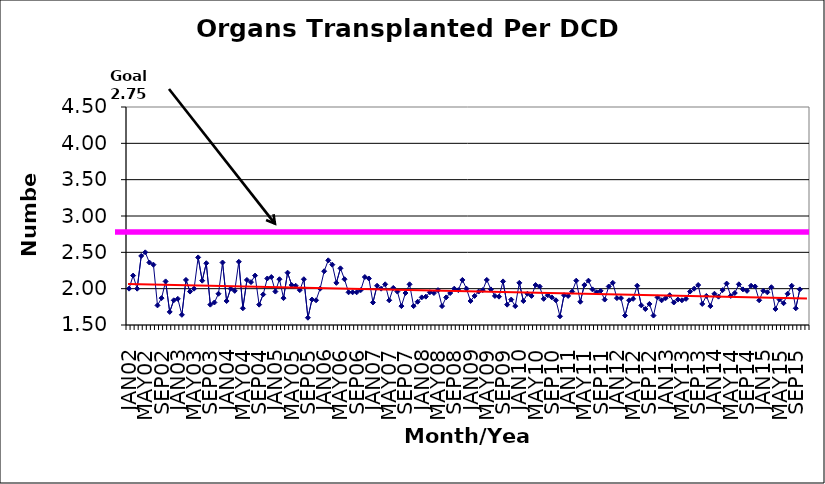
| Category | Series 0 |
|---|---|
| JAN02 | 2 |
| FEB02 | 2.18 |
| MAR02 | 2 |
| APR02 | 2.45 |
| MAY02 | 2.5 |
| JUN02 | 2.36 |
| JUL02 | 2.33 |
| AUG02 | 1.77 |
| SEP02 | 1.87 |
| OCT02 | 2.1 |
| NOV02 | 1.68 |
| DEC02 | 1.84 |
| JAN03 | 1.86 |
| FEB03 | 1.64 |
| MAR03 | 2.12 |
| APR03 | 1.96 |
| MAY03 | 2 |
| JUN03 | 2.43 |
| JUL03 | 2.11 |
| AUG03 | 2.35 |
| SEP03 | 1.78 |
| OCT03 | 1.81 |
| NOV03 | 1.93 |
| DEC03 | 2.36 |
| JAN04 | 1.83 |
| FEB04 | 2 |
| MAR04 | 1.97 |
| APR04 | 2.37 |
| MAY04 | 1.73 |
| JUN04 | 2.12 |
| JUL04 | 2.09 |
| AUG04 | 2.18 |
| SEP04 | 1.78 |
| OCT04 | 1.92 |
| NOV04 | 2.14 |
| DEC04 | 2.16 |
| JAN05 | 1.96 |
| FEB05 | 2.13 |
| MAR05 | 1.87 |
| APR05 | 2.22 |
| MAY05 | 2.05 |
| JUN05 | 2.04 |
| JUL05 | 1.98 |
| AUG05 | 2.13 |
| SEP05 | 1.6 |
| OCT05 | 1.85 |
| NOV05 | 1.84 |
| DEC05 | 2 |
| JAN06 | 2.24 |
| FEB06 | 2.39 |
| MAR06 | 2.33 |
| APR06 | 2.08 |
| MAY06 | 2.28 |
| JUN06 | 2.13 |
| JUL06 | 1.95 |
| AUG06 | 1.95 |
| SEP06 | 1.95 |
| OCT06 | 1.98 |
| NOV06 | 2.16 |
| DEC06 | 2.14 |
| JAN07 | 1.81 |
| FEB07 | 2.04 |
| MAR07 | 2 |
| APR07 | 2.06 |
| MAY07 | 1.84 |
| JUN07 | 2.01 |
| JUL07 | 1.96 |
| AUG07 | 1.76 |
| SEP07 | 1.94 |
| OCT07 | 2.06 |
| NOV07 | 1.76 |
| DEC07 | 1.82 |
| JAN08 | 1.88 |
| FEB08 | 1.89 |
| MAR08 | 1.95 |
| APR08 | 1.94 |
| MAY08 | 1.98 |
| JUN08 | 1.76 |
| JUL08 | 1.88 |
| AUG08 | 1.94 |
| SEP08 | 2 |
| OCT08 | 1.98 |
| NOV08 | 2.12 |
| DEC08 | 2 |
| JAN09 | 1.83 |
| FEB09 | 1.9 |
| MAR09 | 1.96 |
| APR09 | 1.98 |
| MAY09 | 2.12 |
| JUN09 | 1.99 |
| JUL09 | 1.9 |
| AUG09 | 1.89 |
| SEP09 | 2.1 |
| OCT09 | 1.78 |
| NOV09 | 1.85 |
| DEC09 | 1.76 |
| JAN10 | 2.08 |
| FEB10 | 1.83 |
| MAR10 | 1.93 |
| APR10 | 1.9 |
| MAY10 | 2.05 |
| JUN10 | 2.03 |
| JUL10 | 1.86 |
| AUG10 | 1.91 |
| SEP10 | 1.88 |
| OCT10 | 1.84 |
| NOV10 | 1.62 |
| DEC10 | 1.91 |
| JAN11 | 1.9 |
| FEB11 | 1.96 |
| MAR11 | 2.11 |
| APR11 | 1.82 |
| MAY11 | 2.05 |
| JUN11 | 2.11 |
| JUL11 | 1.99 |
| AUG11 | 1.95 |
| SEP11 | 1.97 |
| OCT11 | 1.85 |
| NOV11 | 2.03 |
| DEC11 | 2.08 |
| JAN12 | 1.87 |
| FEB12 | 1.87 |
| MAR12 | 1.63 |
| APR12 | 1.84 |
| MAY12 | 1.86 |
| JUN12 | 2.04 |
| JUL12 | 1.77 |
| AUG12 | 1.72 |
| SEP12 | 1.79 |
| OCT12 | 1.63 |
| NOV12 | 1.88 |
| DEC12 | 1.84 |
| JAN13 | 1.87 |
| FEB13 | 1.91 |
| MAR13 | 1.81 |
| APR13 | 1.85 |
| MAY13 | 1.84 |
| JUN13 | 1.86 |
| JUL13 | 1.96 |
| AUG13 | 2 |
| SEP13 | 2.05 |
| OCT13 | 1.79 |
| NOV13 | 1.9 |
| DEC13 | 1.76 |
| JAN14 | 1.93 |
| FEB14 | 1.89 |
| MAR14 | 1.98 |
| APR14 | 2.07 |
| MAY14 | 1.9 |
| JUN14 | 1.94 |
| JUL14 | 2.06 |
| AUG14 | 1.99 |
| SEP14 | 1.97 |
| OCT14 | 2.04 |
| NOV14 | 2.03 |
| DEC14 | 1.84 |
| JAN15 | 1.97 |
| FEB15 | 1.95 |
| MAR15 | 2.02 |
| APR15 | 1.72 |
| MAY15 | 1.85 |
| JUN15 | 1.8 |
| JUL15 | 1.93 |
| AUG15 | 2.04 |
| SEP15 | 1.73 |
| OCT15 | 1.99 |